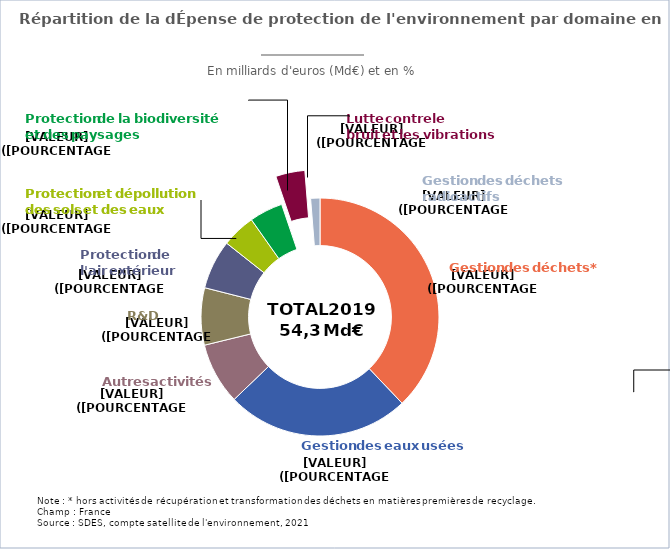
| Category | Series 0 |
|---|---|
| Gestion des déchets* | 20.563 |
| Gestion des eaux usées | 13.526 |
| Autres activités de protection de l'environnement  | 4.543 |
| Recherche et développement pour l'environnement | 4.216 |
| Protection de l'air extérieur | 3.629 |
| Protection et dépollution des sols et des eaux | 2.484 |
| Protection de la biodiversité et des paysages | 2.468 |
| Lutte contre le bruit et les vibrations | 2.151 |
| Gestion des déchets radioactifs | 0.683 |